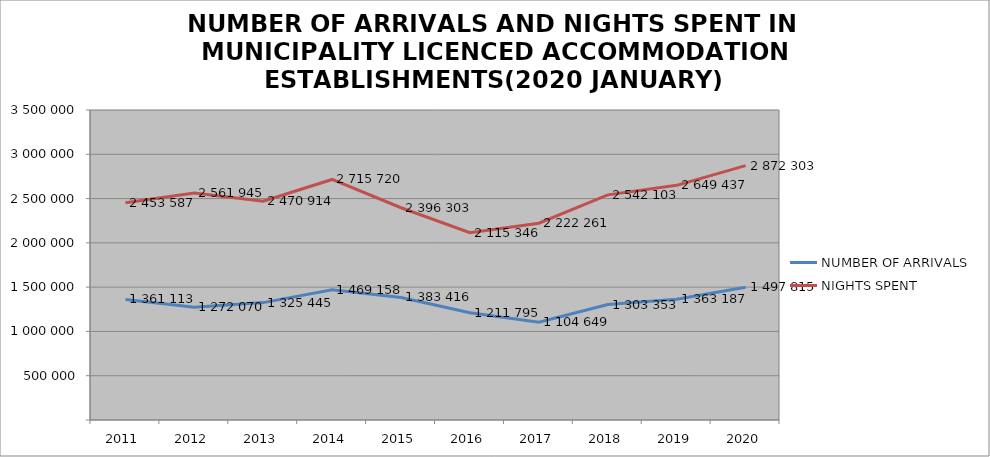
| Category | NUMBER OF ARRIVALS | NIGHTS SPENT |
|---|---|---|
| 2011 | 1361113 | 2453587 |
| 2012 | 1272070 | 2561945 |
| 2013 | 1325445 | 2470914 |
| 2014 | 1469158 | 2715720 |
| 2015 | 1383416 | 2396303 |
| 2016 | 1211795 | 2115346 |
| 2017 | 1104649 | 2222261 |
| 2018 | 1303353 | 2542103 |
| 2019 | 1363187 | 2649437 |
| 2020 | 1497815 | 2872303 |